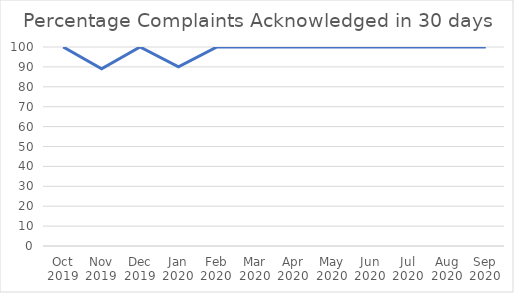
| Category | Percentage |
|---|---|
| Oct 2019 | 100 |
| Nov 2019 | 89 |
| Dec 2019 | 100 |
| Jan 2020 | 90 |
| Feb 2020 | 100 |
| Mar 2020 | 100 |
| Apr 2020 | 100 |
| May 2020 | 100 |
| Jun 2020 | 100 |
| Jul 2020 | 100 |
| Aug 2020 | 100 |
| Sep 2020 | 100 |